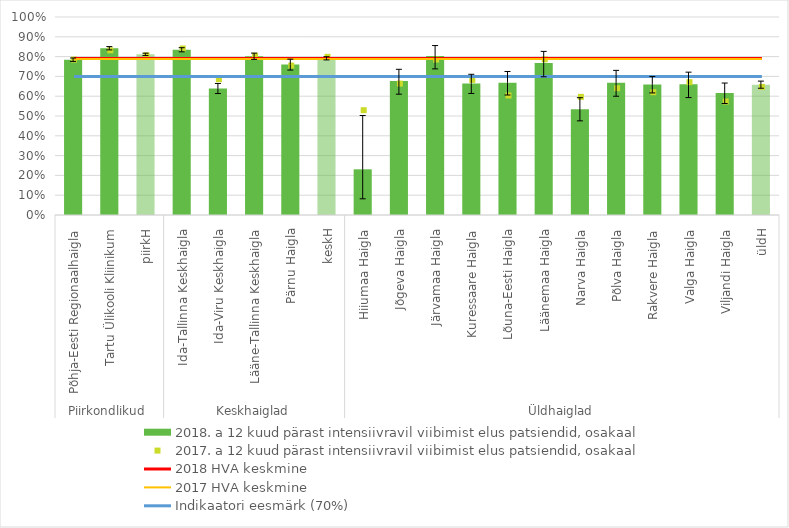
| Category | 2018. a 12 kuud pärast intensiivravil viibimist elus patsiendid, osakaal |
|---|---|
| 0 | 0.784 |
| 1 | 0.842 |
| 2 | 0.811 |
| 3 | 0.835 |
| 4 | 0.639 |
| 5 | 0.802 |
| 6 | 0.761 |
| 7 | 0.791 |
| 8 | 0.231 |
| 9 | 0.676 |
| 10 | 0.803 |
| 11 | 0.664 |
| 12 | 0.668 |
| 13 | 0.768 |
| 14 | 0.535 |
| 15 | 0.668 |
| 16 | 0.659 |
| 17 | 0.66 |
| 18 | 0.616 |
| 19 | 0.658 |